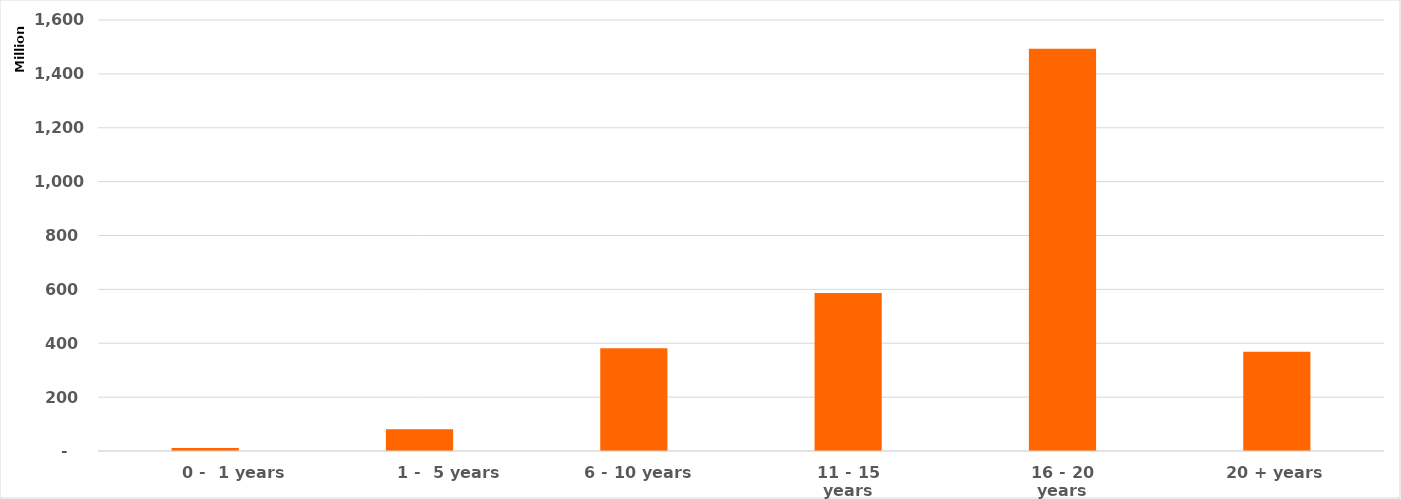
| Category | Maturity category |
|---|---|
|  0 -  1 years | 10696675.27 |
|  1 -  5 years | 80390513.89 |
|  6 - 10 years | 380980693.23 |
| 11 - 15 years | 586280923.96 |
| 16 - 20 years | 1492946756.96 |
| 20 + years | 368269222.41 |